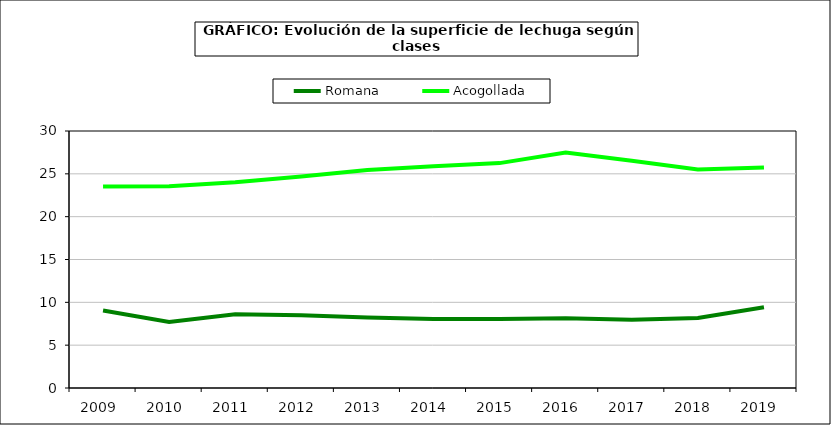
| Category | Romana | Acogollada |
|---|---|---|
| 2009.0 | 9.045 | 23.512 |
| 2010.0 | 7.707 | 23.549 |
| 2011.0 | 8.605 | 24.015 |
| 2012.0 | 8.497 | 24.699 |
| 2013.0 | 8.23 | 25.438 |
| 2014.0 | 8.041 | 25.883 |
| 2015.0 | 8.063 | 26.251 |
| 2016.0 | 8.145 | 27.501 |
| 2017.0 | 7.972 | 26.536 |
| 2018.0 | 8.166 | 25.508 |
| 2019.0 | 9.434 | 25.734 |